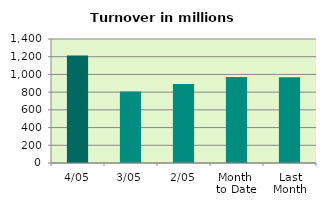
| Category | Series 0 |
|---|---|
| 4/05 | 1213.413 |
| 3/05 | 806.55 |
| 2/05 | 891.706 |
| Month 
to Date | 970.556 |
| Last
Month | 968.247 |